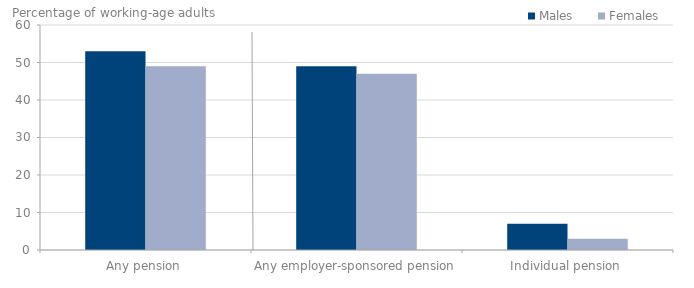
| Category | Males | Females |
|---|---|---|
| 0 | 53 | 49 |
| 1 | 49 | 47 |
| 2 | 7 | 3 |